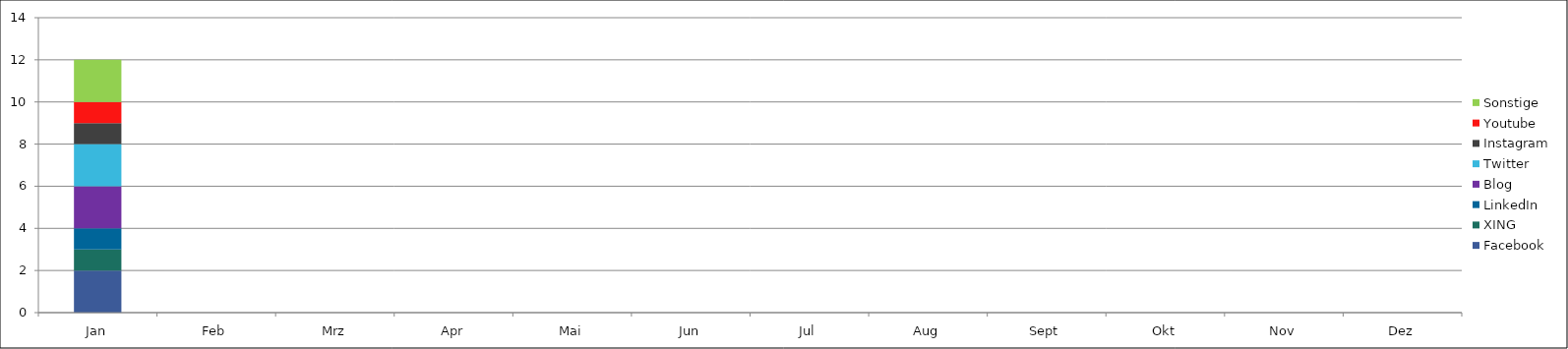
| Category | Facebook | XING | LinkedIn | Blog | Twitter | Instagram | Youtube | Sonstige |
|---|---|---|---|---|---|---|---|---|
| Jan | 2 | 1 | 1 | 2 | 2 | 1 | 1 | 2 |
| Feb | 0 | 0 | 0 | 0 | 0 | 0 | 0 | 0 |
| Mrz | 0 | 0 | 0 | 0 | 0 | 0 | 0 | 0 |
| Apr | 0 | 0 | 0 | 0 | 0 | 0 | 0 | 0 |
| Mai | 0 | 0 | 0 | 0 | 0 | 0 | 0 | 0 |
| Jun | 0 | 0 | 0 | 0 | 0 | 0 | 0 | 0 |
| Jul | 0 | 0 | 0 | 0 | 0 | 0 | 0 | 0 |
| Aug | 0 | 0 | 0 | 0 | 0 | 0 | 0 | 0 |
| Sept | 0 | 0 | 0 | 0 | 0 | 0 | 0 | 0 |
| Okt | 0 | 0 | 0 | 0 | 0 | 0 | 0 | 0 |
| Nov | 0 | 0 | 0 | 0 | 0 | 0 | 0 | 0 |
| Dez | 0 | 0 | 0 | 0 | 0 | 0 | 0 | 0 |